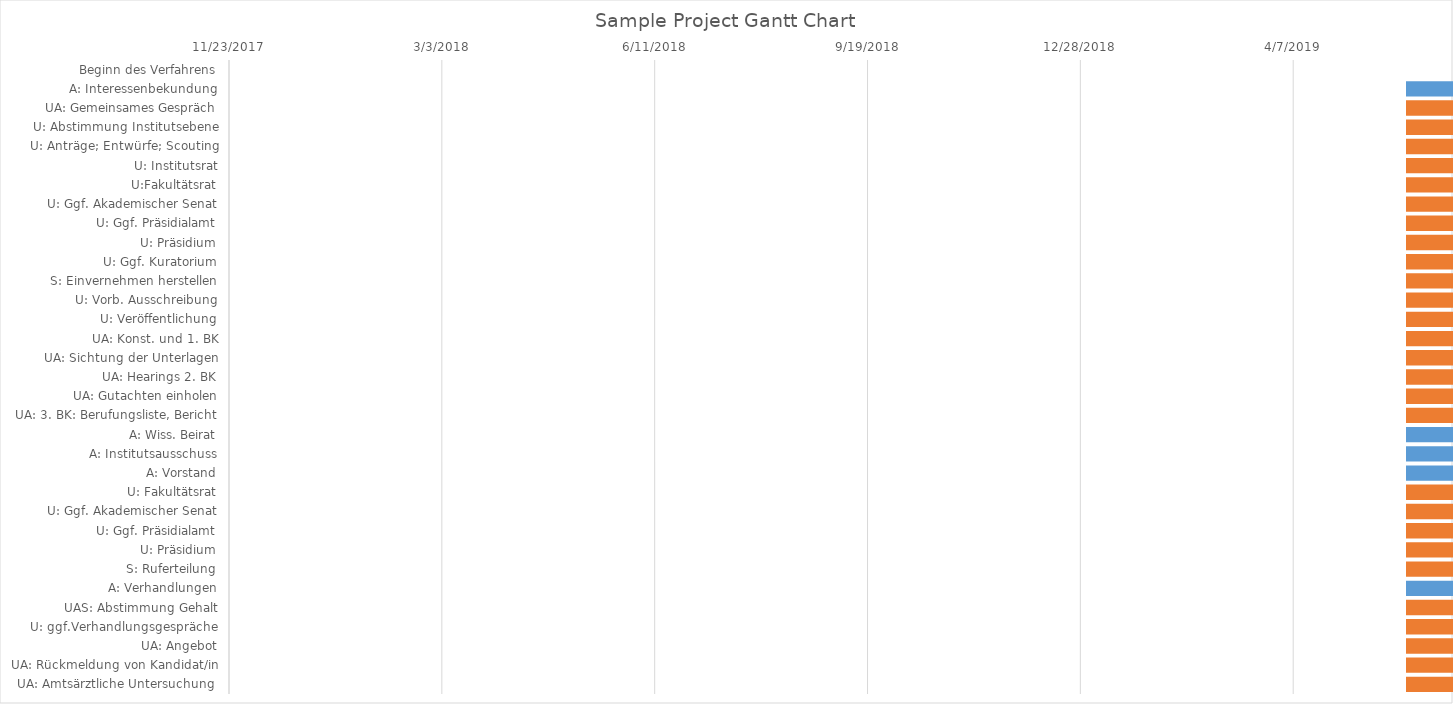
| Category | Start Dates | Duration |
|---|---|---|
| Beginn des Verfahrens | 1/6/21 | 0 |
| A: Interessenbekundung | 1/6/21 | 7 |
| UA: Gemeinsames Gespräch | 1/13/21 | 14 |
| U: Abstimmung Institutsebene | 1/27/21 | 14 |
| U: Anträge; Entwürfe; Scouting | 2/10/21 | 28 |
| U: Institutsrat | 3/10/21 | 14 |
| U:Fakultätsrat | 3/24/21 | 14 |
| U: Ggf. Akademischer Senat | 4/7/21 | 21 |
| U: Ggf. Präsidialamt | 4/7/21 | 21 |
| U: Präsidium | 4/21/21 | 14 |
| U: Ggf. Kuratorium | 5/5/21 | 28 |
| S: Einvernehmen herstellen | 6/2/21 | 28 |
| U: Vorb. Ausschreibung | 6/2/21 | 28 |
| U: Veröffentlichung | 6/30/21 | 28 |
| UA: Konst. und 1. BK | 6/30/21 | 28 |
| UA: Sichtung der Unterlagen | 7/28/21 | 14 |
| UA: Hearings 2. BK | 7/28/21 | 28 |
| UA: Gutachten einholen | 8/25/21 | 70 |
| UA: 3. BK: Berufungsliste, Bericht | 11/3/21 | 28 |
| A: Wiss. Beirat | 12/1/21 | 28 |
| A: Institutsausschuss | 12/29/21 | 14 |
| A: Vorstand | 1/12/22 | 7 |
| U: Fakultätsrat | 12/8/21 | 14 |
| U: Ggf. Akademischer Senat | 12/22/21 | 21 |
| U: Ggf. Präsidialamt | 12/22/21 | 21 |
| U: Präsidium | 1/5/22 | 14 |
| S: Ruferteilung | 1/19/22 | 28 |
| A: Verhandlungen | 2/16/22 | 7 |
| UAS: Abstimmung Gehalt | 2/23/22 | 28 |
| U: ggf.Verhandlungsgespräche | 3/9/22 | 28 |
| UA: Angebot | 4/6/22 | 7 |
| UA: Rückmeldung von Kandidat/in | 4/13/22 | 28 |
| UA: Amtsärztliche Untersuchung  | 4/13/22 | 42 |